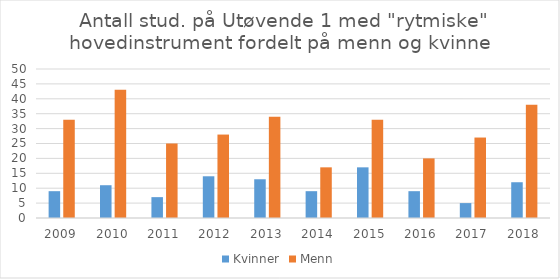
| Category | Kvinner | Menn |
|---|---|---|
| 2009.0 | 9 | 33 |
| 2010.0 | 11 | 43 |
| 2011.0 | 7 | 25 |
| 2012.0 | 14 | 28 |
| 2013.0 | 13 | 34 |
| 2014.0 | 9 | 17 |
| 2015.0 | 17 | 33 |
| 2016.0 | 9 | 20 |
| 2017.0 | 5 | 27 |
| 2018.0 | 12 | 38 |